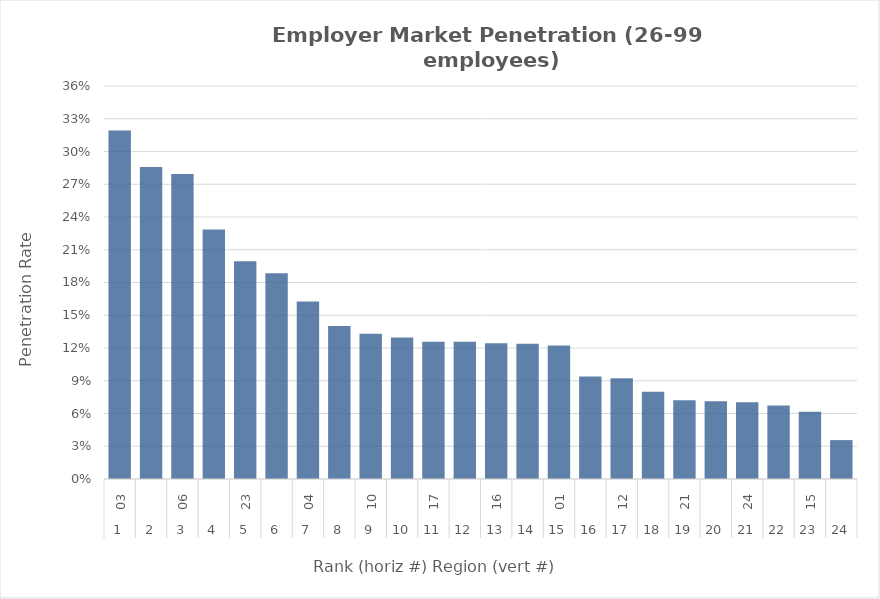
| Category | Rate |
|---|---|
| 0 | 0.319 |
| 1 | 0.286 |
| 2 | 0.28 |
| 3 | 0.229 |
| 4 | 0.199 |
| 5 | 0.188 |
| 6 | 0.163 |
| 7 | 0.14 |
| 8 | 0.133 |
| 9 | 0.13 |
| 10 | 0.126 |
| 11 | 0.126 |
| 12 | 0.124 |
| 13 | 0.124 |
| 14 | 0.122 |
| 15 | 0.094 |
| 16 | 0.092 |
| 17 | 0.08 |
| 18 | 0.072 |
| 19 | 0.071 |
| 20 | 0.07 |
| 21 | 0.067 |
| 22 | 0.062 |
| 23 | 0.036 |